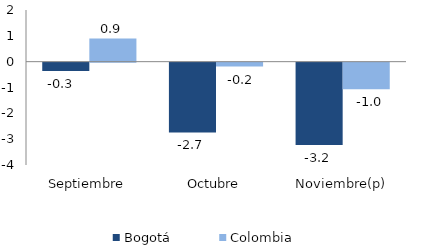
| Category | Bogotá | Colombia |
|---|---|---|
| Septiembre | -0.324 | 0.901 |
| Octubre | -2.702 | -0.151 |
| Noviembre(p) | -3.184 | -1.026 |